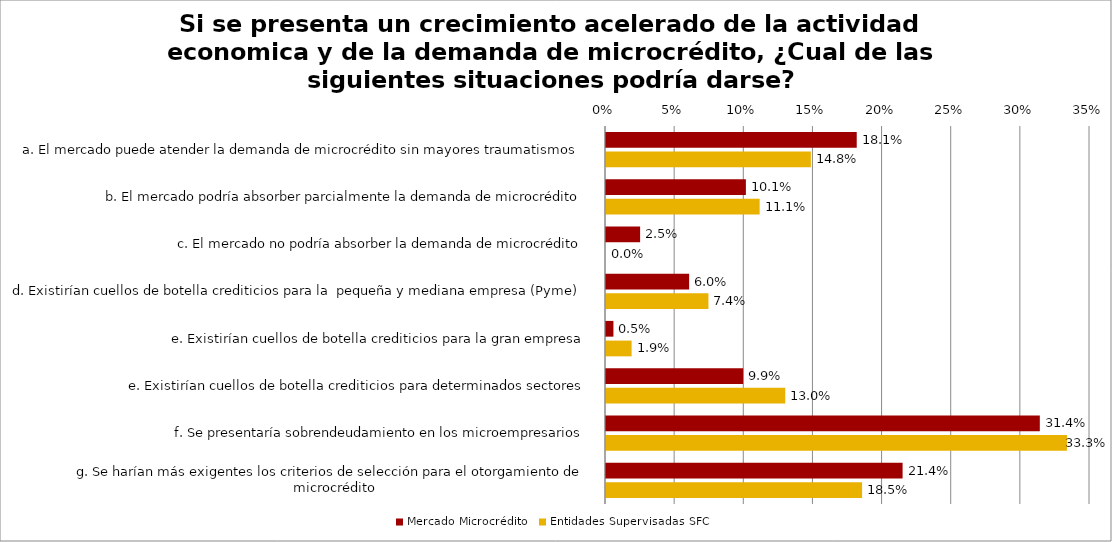
| Category | Mercado Microcrédito | Entidades Supervisadas SFC |
|---|---|---|
| a. El mercado puede atender la demanda de microcrédito sin mayores traumatismos | 0.181 | 0.148 |
| b. El mercado podría absorber parcialmente la demanda de microcrédito | 0.101 | 0.111 |
| c. El mercado no podría absorber la demanda de microcrédito | 0.025 | 0 |
| d. Existirían cuellos de botella crediticios para la  pequeña y mediana empresa (Pyme) | 0.06 | 0.074 |
| e. Existirían cuellos de botella crediticios para la gran empresa | 0.005 | 0.019 |
| e. Existirían cuellos de botella crediticios para determinados sectores | 0.099 | 0.13 |
| f. Se presentaría sobrendeudamiento en los microempresarios | 0.314 | 0.333 |
| g. Se harían más exigentes los criterios de selección para el otorgamiento de microcrédito | 0.214 | 0.185 |